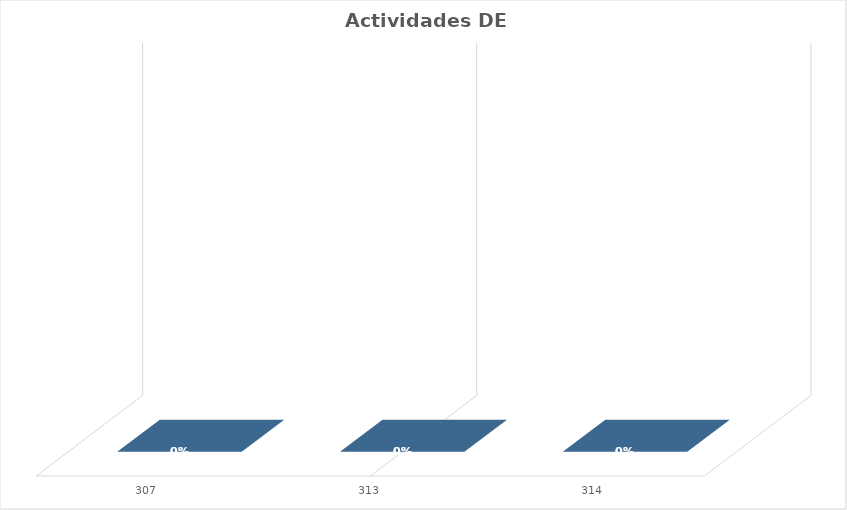
| Category | % Avance |
|---|---|
| 307.0 | 0 |
| 313.0 | 0 |
| 314.0 | 0 |